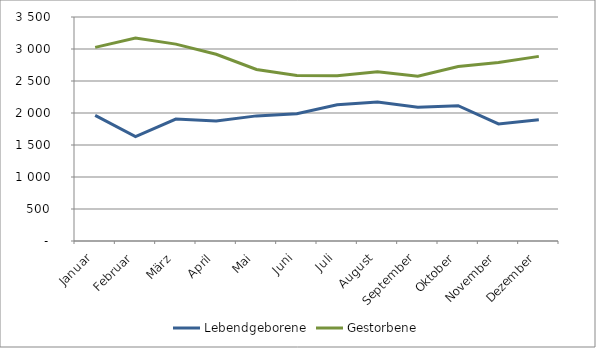
| Category | Lebendgeborene | Gestorbene |
|---|---|---|
| Januar | 1962 | 3026 |
| Februar | 1632 | 3173 |
| März | 1906 | 3076 |
| April | 1876 | 2918 |
| Mai | 1955 | 2681 |
| Juni | 1989 | 2586 |
| Juli | 2129 | 2583 |
| August | 2171 | 2645 |
| September | 2091 | 2576 |
| Oktober | 2115 | 2726 |
| November | 1829 | 2788 |
| Dezember | 1894 | 2885 |